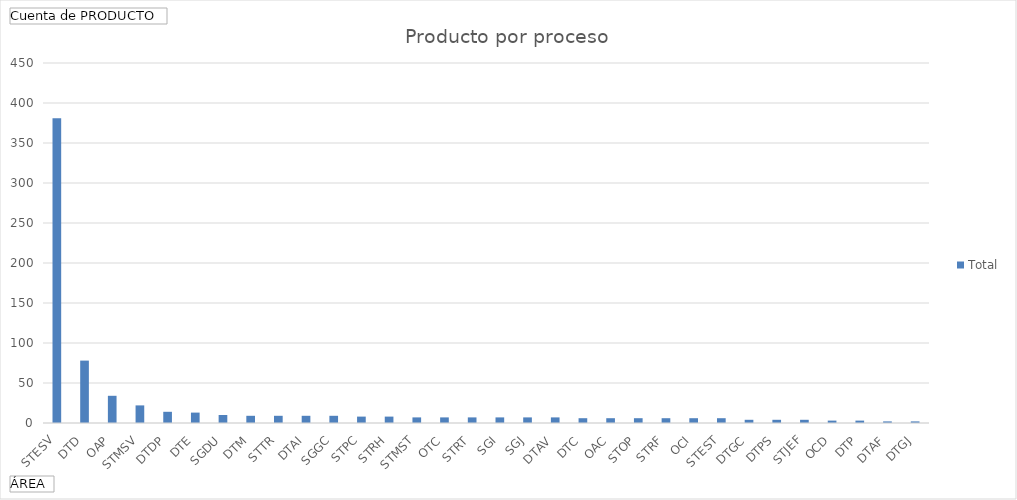
| Category | Total |
|---|---|
| STESV | 381 |
| DTD | 78 |
| OAP | 34 |
| STMSV | 22 |
| DTDP | 14 |
| DTE | 13 |
| SGDU | 10 |
| DTM | 9 |
| STTR | 9 |
| DTAI | 9 |
| SGGC | 9 |
| STPC | 8 |
| STRH | 8 |
| STMST | 7 |
| OTC | 7 |
| STRT | 7 |
| SGI | 7 |
| SGJ | 7 |
| DTAV | 7 |
| DTC | 6 |
| OAC | 6 |
| STOP | 6 |
| STRF | 6 |
| OCI | 6 |
| STEST | 6 |
| DTGC | 4 |
| DTPS | 4 |
| STJEF | 4 |
| OCD | 3 |
| DTP | 3 |
| DTAF | 2 |
| DTGJ | 2 |